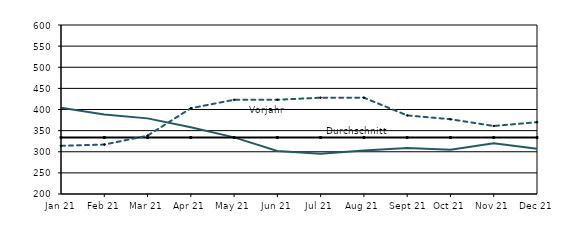
| Category | Berichtsjahr | Durchschnitt | Vorjahr |
|---|---|---|---|
| 2021-01-01 | 404 | 333.667 | 314 |
| 2021-02-01 | 388 | 333.667 | 317 |
| 2021-03-01 | 379 | 333.667 | 338 |
| 2021-04-01 | 358 | 333.667 | 403 |
| 2021-05-01 | 334 | 333.667 | 423 |
| 2021-06-01 | 302 | 333.667 | 423 |
| 2021-07-01 | 295 | 333.667 | 428 |
| 2021-08-01 | 303 | 333.667 | 428 |
| 2021-09-01 | 309 | 333.667 | 386 |
| 2021-10-01 | 305 | 333.667 | 377 |
| 2021-11-01 | 320 | 333.667 | 361 |
| 2021-12-01 | 307 | 333.667 | 370 |